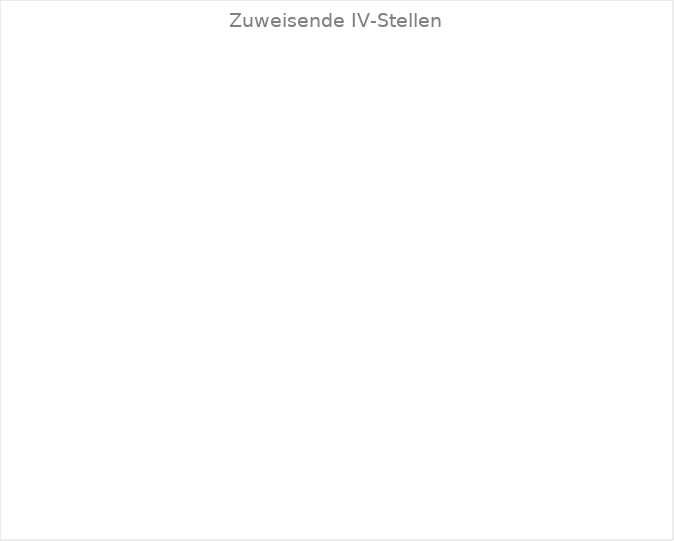
| Category | Series 0 |
|---|---|
| AG  | 0 |
| AI | 0 |
| AR | 0 |
| BE | 0 |
| BL | 0 |
| BS | 0 |
| FR | 0 |
| GE | 0 |
| GL | 0 |
| GR | 0 |
| JU | 0 |
| LU | 0 |
| NE | 0 |
| NW | 0 |
| OW | 0 |
| SG  | 0 |
| SH | 0 |
| SO | 0 |
| SZ  | 0 |
| TG | 0 |
| TI | 0 |
| UR  | 0 |
| VD | 0 |
| VS | 0 |
| ZG | 0 |
| ZH | 0 |